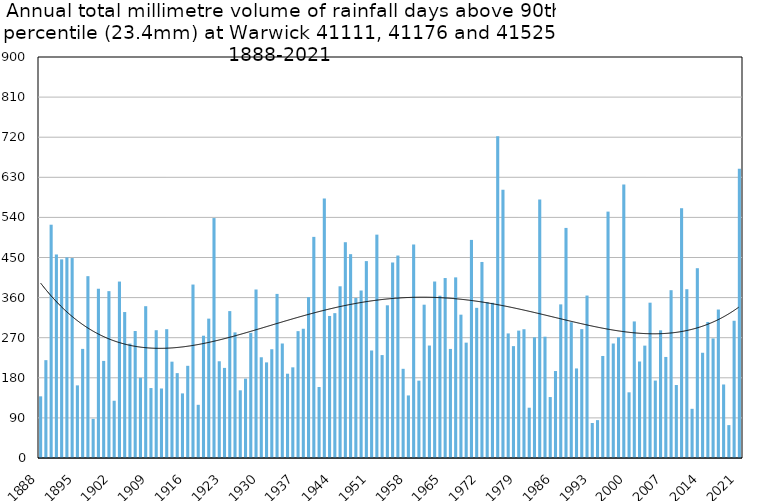
| Category | Annual total mm in days above 90th percentile |
|---|---|
| 1888 | 138.4 |
| 1889 | 219.6 |
| 1890 | 523.6 |
| 1891 | 456.8 |
| 1892 | 445.8 |
| 1893 | 450.3 |
| 1894 | 448.8 |
| 1895 | 163 |
| 1896 | 244.9 |
| 1897 | 408.1 |
| 1898 | 87.9 |
| 1899 | 379.9 |
| 1900 | 217.9 |
| 1901 | 374.5 |
| 1902 | 128.5 |
| 1903 | 396 |
| 1904 | 327.6 |
| 1905 | 256.8 |
| 1906 | 285 |
| 1907 | 180.1 |
| 1908 | 340.7 |
| 1909 | 157 |
| 1910 | 286.8 |
| 1911 | 156 |
| 1912 | 289.1 |
| 1913 | 216.2 |
| 1914 | 190.5 |
| 1915 | 145 |
| 1916 | 206.9 |
| 1917 | 389.3 |
| 1918 | 119.4 |
| 1919 | 274.5 |
| 1920 | 312.8 |
| 1921 | 538.5 |
| 1922 | 217.1 |
| 1923 | 202.2 |
| 1924 | 329.7 |
| 1925 | 282 |
| 1926 | 151.9 |
| 1927 | 178.1 |
| 1928 | 280.8 |
| 1929 | 378.2 |
| 1930 | 226.1 |
| 1931 | 214.6 |
| 1932 | 244.1 |
| 1933 | 368.3 |
| 1934 | 257 |
| 1935 | 189.2 |
| 1936 | 203.5 |
| 1937 | 284.7 |
| 1938 | 290.1 |
| 1939 | 361.1 |
| 1940 | 496.3 |
| 1941 | 159.3 |
| 1942 | 582.3 |
| 1943 | 318.8 |
| 1944 | 325.1 |
| 1945 | 385.4 |
| 1946 | 484.3 |
| 1947 | 457.5 |
| 1948 | 359.2 |
| 1949 | 375.9 |
| 1950 | 441.9 |
| 1951 | 241.3 |
| 1952 | 501.3 |
| 1953 | 231 |
| 1954 | 342.7 |
| 1955 | 438.8 |
| 1956 | 454.4 |
| 1957 | 200.2 |
| 1958 | 140.4 |
| 1959 | 479.2 |
| 1960 | 173.6 |
| 1961 | 344.1 |
| 1962 | 252.4 |
| 1963 | 396.1 |
| 1964 | 364.2 |
| 1965 | 403.9 |
| 1966 | 244.8 |
| 1967 | 405.4 |
| 1968 | 321.7 |
| 1969 | 258.9 |
| 1970 | 489.5 |
| 1971 | 337 |
| 1972 | 440 |
| 1973 | 349.7 |
| 1974 | 348.4 |
| 1975 | 722.2 |
| 1976 | 601.8 |
| 1977 | 279.6 |
| 1978 | 251.1 |
| 1979 | 285.9 |
| 1980 | 289 |
| 1981 | 112.9 |
| 1982 | 270.8 |
| 1983 | 580.4 |
| 1984 | 272.3 |
| 1985 | 136.8 |
| 1986 | 195.2 |
| 1987 | 344.8 |
| 1988 | 516.4 |
| 1989 | 304.8 |
| 1990 | 201 |
| 1991 | 289.2 |
| 1992 | 364.6 |
| 1993 | 78.6 |
| 1994 | 85 |
| 1995 | 229 |
| 1996 | 553 |
| 1997 | 257 |
| 1998 | 271 |
| 1999 | 614 |
| 2000 | 147.4 |
| 2001 | 306.5 |
| 2002 | 216.6 |
| 2003 | 252.2 |
| 2004 | 348.6 |
| 2005 | 173.8 |
| 2006 | 286.6 |
| 2007 | 226.8 |
| 2008 | 376.6 |
| 2009 | 163.8 |
| 2010 | 560.6 |
| 2011 | 378.8 |
| 2012 | 110.4 |
| 2013 | 426 |
| 2014 | 236.2 |
| 2015 | 305.3 |
| 2016 | 268.4 |
| 2017 | 333.2 |
| 2018 | 165 |
| 2019 | 73.8 |
| 2020 | 308 |
| 2021 | 649.2 |